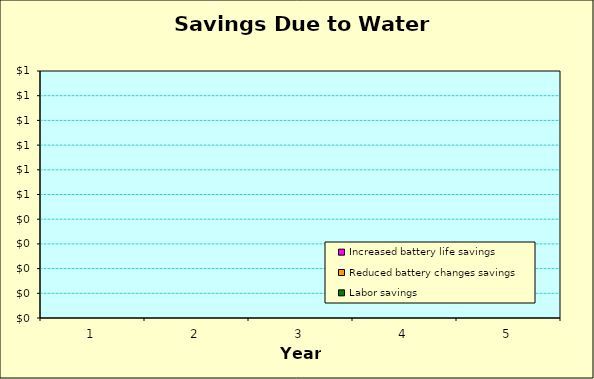
| Category | Labor savings | Reduced battery changes savings | Increased battery life savings |
|---|---|---|---|
| 0 | 0 | 0 | 0 |
| 1 | 0 | 0 | 0 |
| 2 | 0 | 0 | 0 |
| 3 | 0 | 0 | 0 |
| 4 | 0 | 0 | 0 |